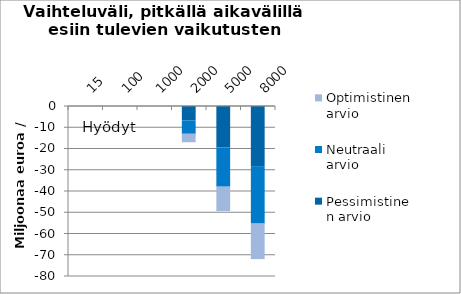
| Category | Pessimistinen arvio | Neutraali arvio | Optimistinen arvio |
|---|---|---|---|
| 15.0 | 0 | 0 | 0 |
| 100.0 | 0 | 0 | 0 |
| 1000.0 | 0 | 0 | 0 |
| 2000.0 | -6.818 | -6.255 | -3.978 |
| 5000.0 | -19.543 | -18.418 | -11.501 |
| 8000.0 | -28.291 | -27.041 | -16.725 |